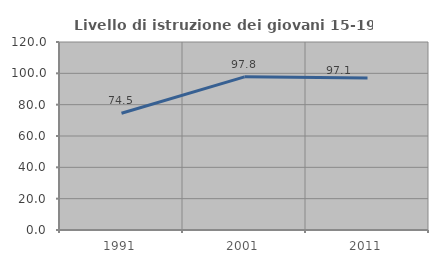
| Category | Livello di istruzione dei giovani 15-19 anni |
|---|---|
| 1991.0 | 74.51 |
| 2001.0 | 97.778 |
| 2011.0 | 97.059 |